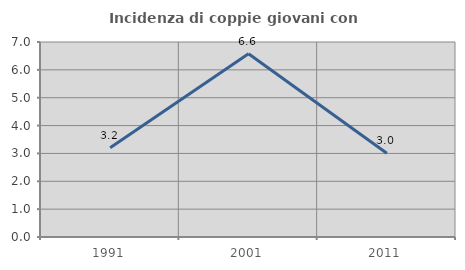
| Category | Incidenza di coppie giovani con figli |
|---|---|
| 1991.0 | 3.205 |
| 2001.0 | 6.579 |
| 2011.0 | 3.008 |